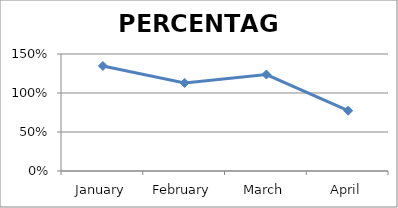
| Category | PERCENTAGE |
|---|---|
| January | 1.347 |
| February | 1.128 |
| March | 1.237 |
| April | 0.773 |